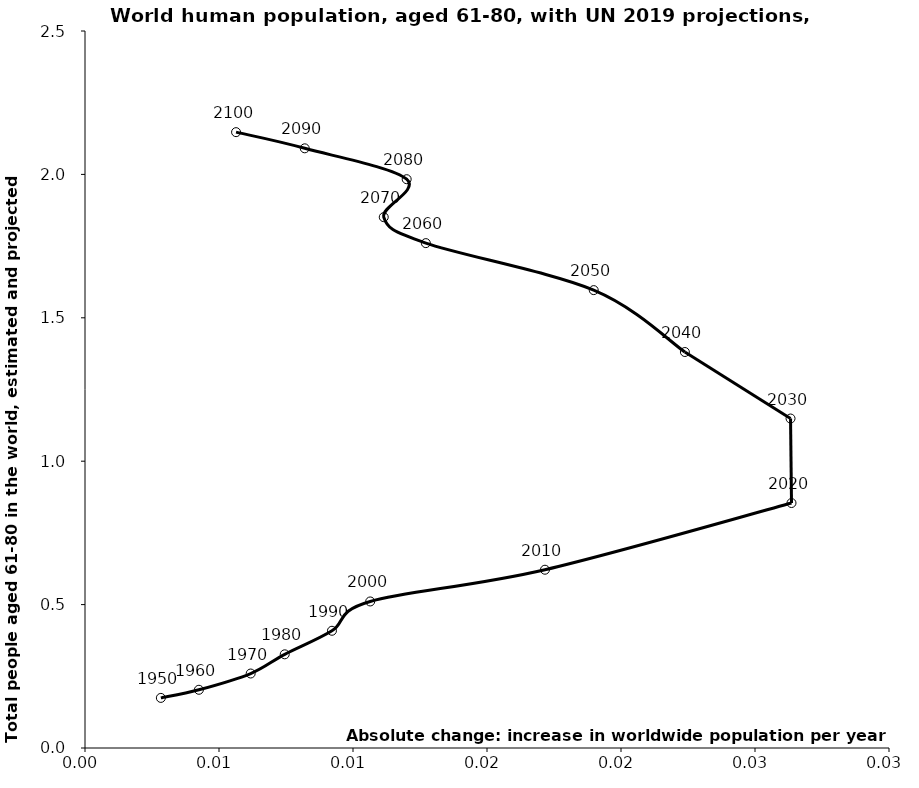
| Category | Series 0 |
|---|---|
| 0.0028305999 | 0.175 |
| 0.004250227950000002 | 0.203 |
| 0.006182192150000003 | 0.26 |
| 0.0074527451500000005 | 0.327 |
| 0.009214784149999997 | 0.409 |
| 0.010641911649999993 | 0.511 |
| 0.01716276669999999 | 0.622 |
| 0.026362156300000016 | 0.854 |
| 0.026326056050000025 | 1.149 |
| 0.02238380685000001 | 1.381 |
| 0.018982052449999964 | 1.597 |
| 0.012718051299999988 | 1.76 |
| 0.0111471855 | 1.851 |
| 0.012002807699999984 | 1.983 |
| 0.008199789150000025 | 2.091 |
| 0.005636838400000022 | 2.147 |